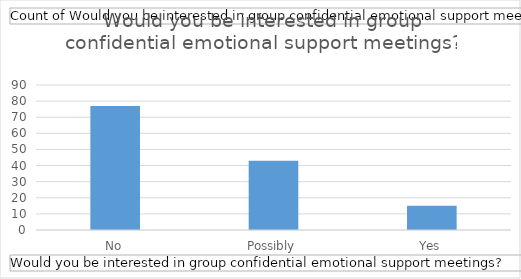
| Category | Total |
|---|---|
| No | 77 |
| Possibly | 43 |
| Yes | 15 |